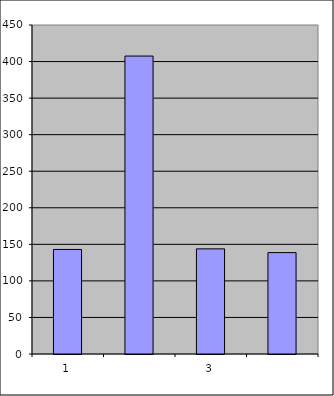
| Category | Series 0 |
|---|---|
| 0 | 143 |
| 1 | 407.526 |
| 2 | 143.801 |
| 3 | 138.695 |